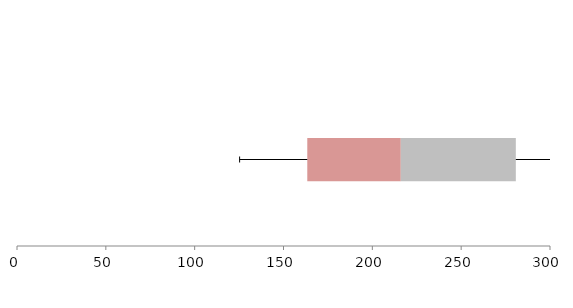
| Category | Series 1 | Series 2 | Series 3 |
|---|---|---|---|
| 0 | 163.387 | 52.636 | 64.74 |